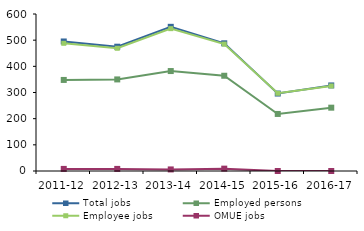
| Category | Total jobs | Employed persons | Employee jobs | OMUE jobs |
|---|---|---|---|---|
| 2011-12 | 495 | 348 | 488 | 8 |
| 2012-13 | 475 | 350 | 469 | 8 |
| 2013-14 | 551 | 382 | 544 | 6 |
| 2014-15 | 488 | 364 | 485 | 9 |
| 2015-16 | 296 | 218 | 297 | 0 |
| 2016-17 | 327 | 242 | 325 | 0 |